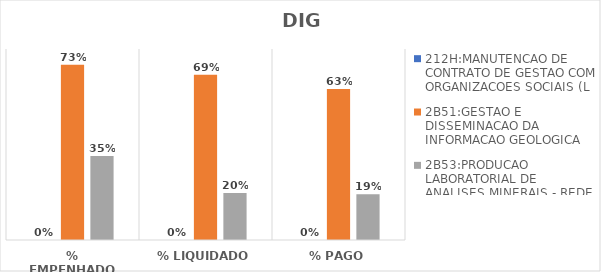
| Category | 212H:MANUTENCAO DE CONTRATO DE GESTAO COM ORGANIZACOES SOCIAIS (L | 2B51:GESTAO E DISSEMINACAO DA INFORMACAO GEOLOGICA | 2B53:PRODUCAO LABORATORIAL DE ANALISES MINERAIS - REDE LAMIN |
|---|---|---|---|
| % EMPENHADO | 0 | 0.734 | 0.351 |
| % LIQUIDADO | 0 | 0.692 | 0.197 |
| % PAGO | 0 | 0.633 | 0.192 |